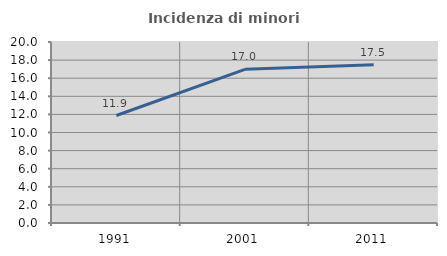
| Category | Incidenza di minori stranieri |
|---|---|
| 1991.0 | 11.877 |
| 2001.0 | 16.984 |
| 2011.0 | 17.484 |